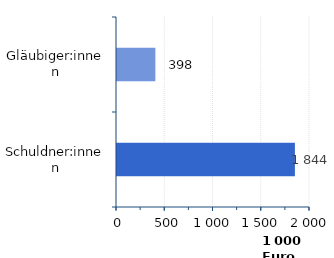
| Category | Series 0 |
|---|---|
| Gläubiger:innen | 397.594 |
| Schuldner:innen | 1843.666 |